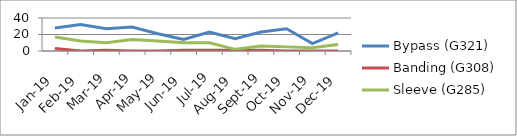
| Category | Bypass (G321) | Banding (G308) | Sleeve (G285) |
|---|---|---|---|
| 2019-01-01 | 28 | 3 | 17 |
| 2019-02-01 | 32 | 0 | 12 |
| 2019-03-01 | 27 | 1 | 10 |
| 2019-04-01 | 29 | 0 | 14 |
| 2019-05-01 | 21 | 0 | 12 |
| 2019-06-01 | 14 | 1 | 10 |
| 2019-07-01 | 23 | 1 | 10 |
| 2019-08-01 | 15 | 1 | 2 |
| 2019-09-01 | 23 | 1 | 6 |
| 2019-10-01 | 27 | 0 | 5 |
| 2019-11-01 | 9 | 0 | 4 |
| 2019-12-01 | 22 | 0 | 8 |